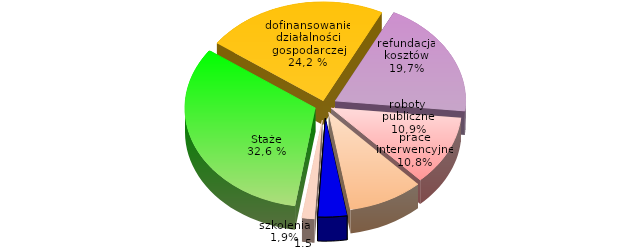
| Category | proc. |
|---|---|
| Staże | 32.394 |
| Dofinansowanie działalności gospodarczej | 22.518 |
| Refundacja kosztów wyposażenia lub doposażenia miejsca pracy | 19.206 |
| Prace interwencyjne | 11.4 |
| Roboty publiczne | 9.315 |
| Bon na zasiedlenie | 3.618 |
| Szkolenia | 1.549 |